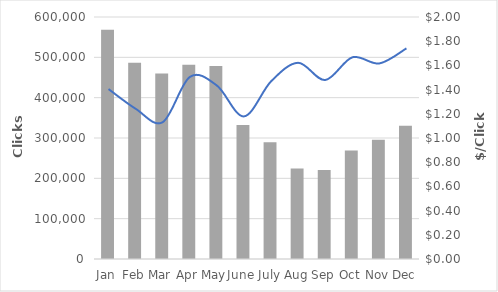
| Category | Clicks |
|---|---|
| Jan | 568213 |
| Feb | 486398 |
| Mar | 459937 |
| Apr | 481632 |
| May | 478822 |
| June | 332313 |
| July | 289154 |
| Aug | 224080 |
| Sep | 220951 |
| Oct | 268924 |
| Nov | 295562 |
| Dec | 330514 |